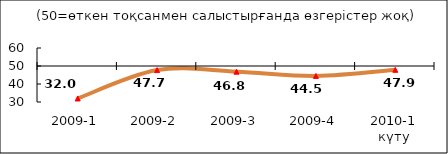
| Category | Диф.индекс ↓ |
|---|---|
| 2009-1 | 31.96 |
| 2009-2 | 47.725 |
| 2009-3 | 46.82 |
| 2009-4 | 44.48 |
| 2010-1 күту | 47.865 |